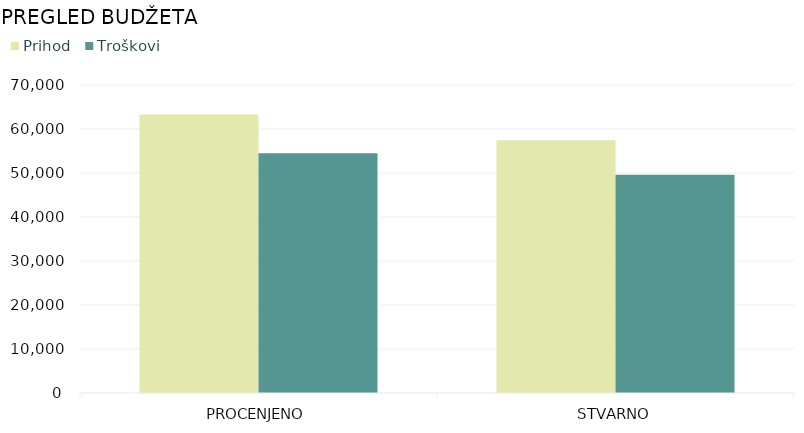
| Category | Prihod | Troškovi |
|---|---|---|
| PROCENJENO | 63300 | 54500 |
| STVARNO | 57450 | 49630 |